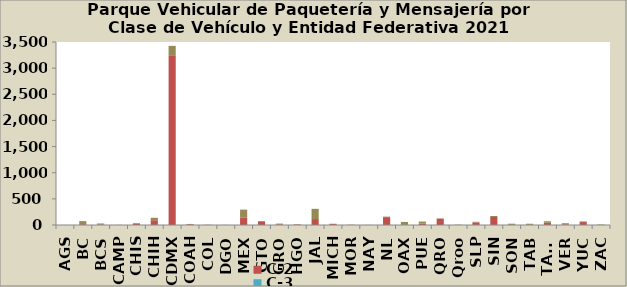
| Category | C-2 | C-3 | Camioneta |
|---|---|---|---|
| AGS | 1 | 0 | 0 |
| BC | 15 | 0 | 59 |
| BCS | 5 | 0 | 24 |
| CAMP | 2 | 0 | 0 |
| CHIS | 32 | 0 | 0 |
| CHIH | 92 | 0 | 46 |
| CDMX | 3247 | 0 | 179 |
| COAH | 14 | 0 | 6 |
| COL | 4 | 0 | 1 |
| DGO | 1 | 0 | 1 |
| MEX | 145 | 0 | 149 |
| GTO | 72 | 0 | 0 |
| GRO | 13 | 0 | 14 |
| HGO | 11 | 1 | 0 |
| JAL | 114 | 0 | 195 |
| MICH | 18 | 0 | 6 |
| MOR | 4 | 0 | 1 |
| NAY | 2 | 0 | 0 |
| NL | 134 | 0 | 26 |
| OAX | 2 | 0 | 56 |
| PUE | 25 | 0 | 41 |
| QRO | 122 | 0 | 5 |
| Qroo | 2 | 0 | 4 |
| SLP | 50 | 0 | 11 |
| SIN | 153 | 0 | 19 |
| SON | 2 | 0 | 23 |
| TAB | 3 | 0 | 21 |
| TAMS | 44 | 0 | 28 |
| VER | 13 | 0 | 21 |
| YUC | 56 | 0 | 13 |
| ZAC | 1 | 0 | 8 |